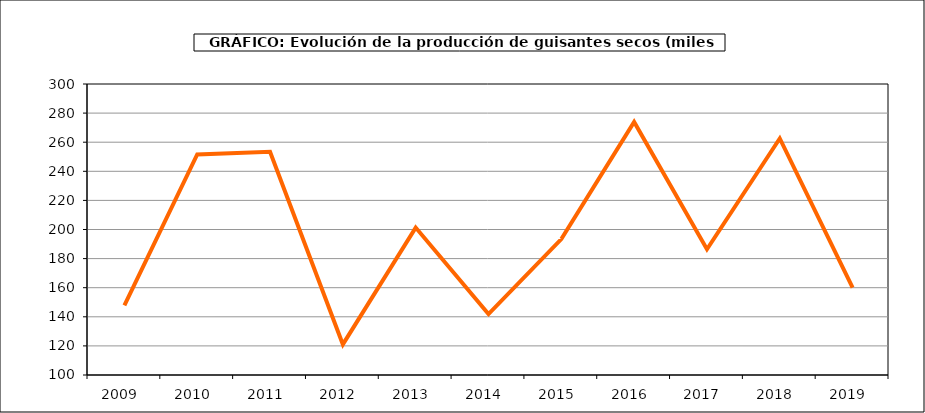
| Category | Producción |
|---|---|
| 2009.0 | 147.87 |
| 2010.0 | 251.575 |
| 2011.0 | 253.427 |
| 2012.0 | 121.017 |
| 2013.0 | 201.326 |
| 2014.0 | 141.855 |
| 2015.0 | 193.389 |
| 2016.0 | 273.954 |
| 2017.0 | 186.406 |
| 2018.0 | 262.567 |
| 2019.0 | 160.115 |